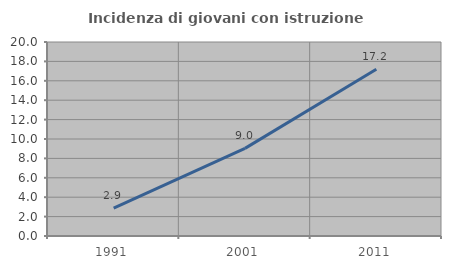
| Category | Incidenza di giovani con istruzione universitaria |
|---|---|
| 1991.0 | 2.874 |
| 2001.0 | 9.036 |
| 2011.0 | 17.197 |